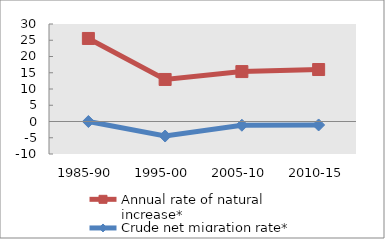
| Category | Annual rate of natural increase* | Crude net migration rate* |
|---|---|---|
| 1985-90 | 25.55 | 0 |
| 1995-00 | 12.937 | -4.469 |
| 2005-10 | 15.364 | -1.145 |
| 2010-15 | 15.992 | -1.065 |